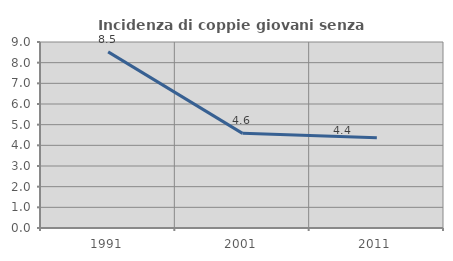
| Category | Incidenza di coppie giovani senza figli |
|---|---|
| 1991.0 | 8.522 |
| 2001.0 | 4.579 |
| 2011.0 | 4.372 |